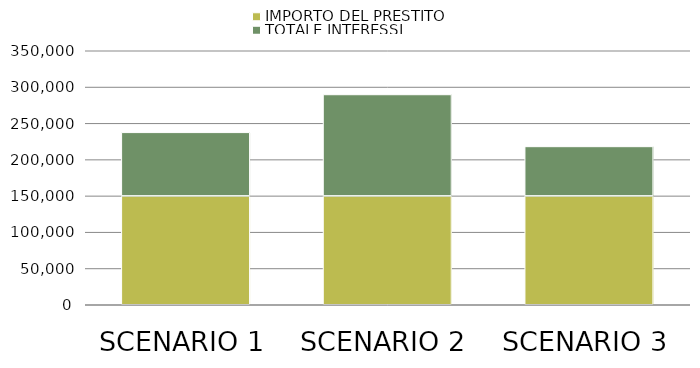
| Category | IMPORTO DEL PRESTITO | TOTALE INTERESSI |
|---|---|---|
| SCENARIO 1 | 150000 | 87584.066 |
| SCENARIO 2 | 150000 | 139753.762 |
| SCENARIO 3 | 150000 | 68152.919 |